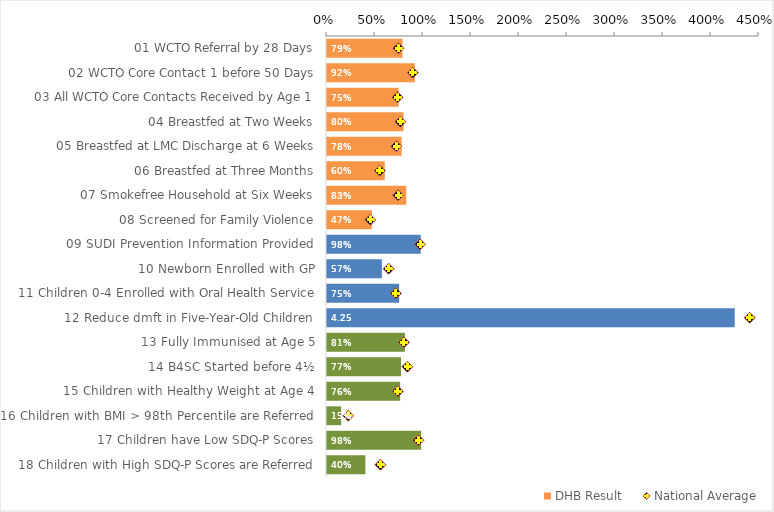
| Category | DHB Result |
|---|---|
| 01 WCTO Referral by 28 Days | 0.787 |
| 02 WCTO Core Contact 1 before 50 Days | 0.915 |
| 03 All WCTO Core Contacts Received by Age 1 | 0.745 |
| 04 Breastfed at Two Weeks | 0.797 |
| 05 Breastfed at LMC Discharge at 6 Weeks | 0.777 |
| 06 Breastfed at Three Months | 0.602 |
| 07 Smokefree Household at Six Weeks | 0.825 |
| 08 Screened for Family Violence | 0.467 |
| 09 SUDI Prevention Information Provided | 0.976 |
| 10 Newborn Enrolled with GP | 0.572 |
| 11 Children 0-4 Enrolled with Oral Health Service | 0.752 |
| 12 Reduce dmft in Five-Year-Old Children | 4.247 |
| 13 Fully Immunised at Age 5 | 0.812 |
| 14 B4SC Started before 4½ | 0.771 |
| 15 Children with Healthy Weight at Age 4 | 0.762 |
| 16 Children with BMI > 98th Percentile are Referred | 0.148 |
| 17 Children have Low SDQ-P Scores | 0.98 |
| 18 Children with High SDQ-P Scores are Referred | 0.4 |